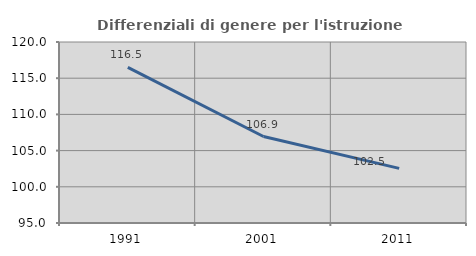
| Category | Differenziali di genere per l'istruzione superiore |
|---|---|
| 1991.0 | 116.505 |
| 2001.0 | 106.946 |
| 2011.0 | 102.542 |